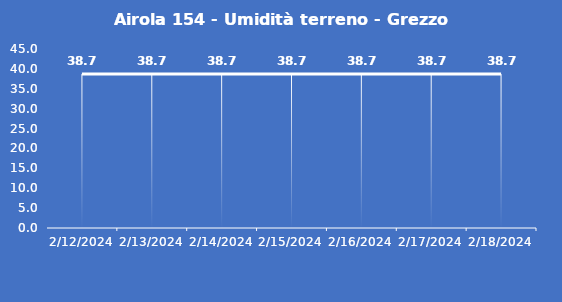
| Category | Airola 154 - Umidità terreno - Grezzo (%VWC) |
|---|---|
| 2/12/24 | 38.7 |
| 2/13/24 | 38.7 |
| 2/14/24 | 38.7 |
| 2/15/24 | 38.7 |
| 2/16/24 | 38.7 |
| 2/17/24 | 38.7 |
| 2/18/24 | 38.7 |